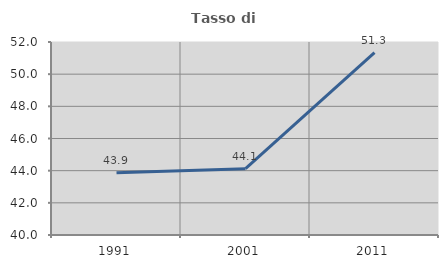
| Category | Tasso di occupazione   |
|---|---|
| 1991.0 | 43.873 |
| 2001.0 | 44.125 |
| 2011.0 | 51.339 |